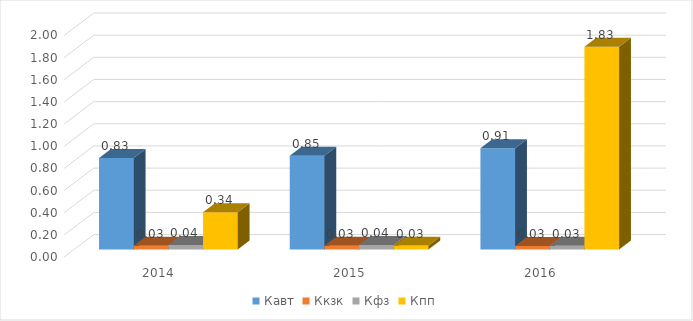
| Category | Кавт | Ккзк | Кфз | Кпп |
|---|---|---|---|---|
| 2014.0 | 0.825 | 0.033 | 0.04 | 0.336 |
| 2015.0 | 0.846 | 0.034 | 0.04 | 0.035 |
| 2016.0 | 0.913 | 0.032 | 0.035 | 1.829 |